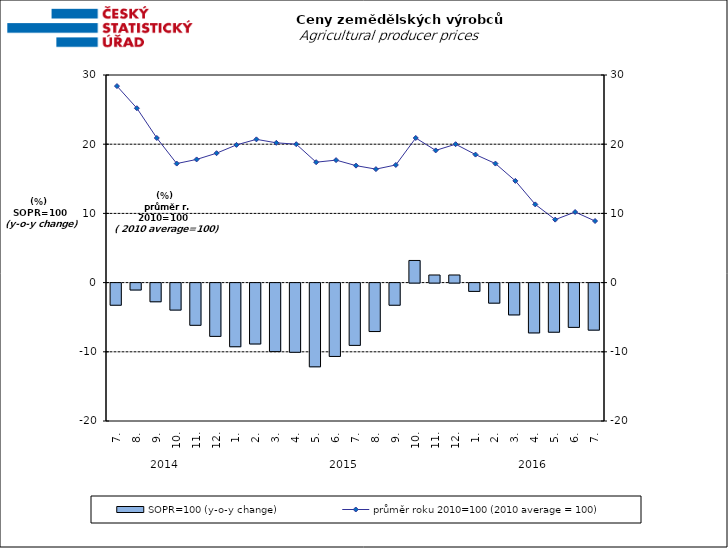
| Category | SOPR=100 (y-o-y change)   |
|---|---|
| 0 | -3.2 |
| 1 | -1 |
| 2 | -2.7 |
| 3 | -3.9 |
| 4 | -6.1 |
| 5 | -7.7 |
| 6 | -9.2 |
| 7 | -8.8 |
| 8 | -9.9 |
| 9 | -10 |
| 10 | -12.1 |
| 11 | -10.6 |
| 12 | -9 |
| 13 | -7 |
| 14 | -3.2 |
| 15 | 3.2 |
| 16 | 1.1 |
| 17 | 1.1 |
| 18 | -1.2 |
| 19 | -2.9 |
| 20 | -4.6 |
| 21 | -7.2 |
| 22 | -7.1 |
| 23 | -6.4 |
| 24 | -6.8 |